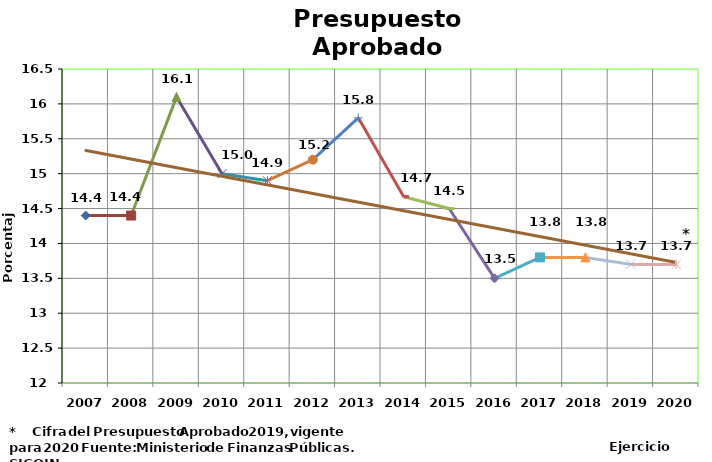
| Category | Series 0 |
|---|---|
| 2007 | 14.4 |
| 2008 | 14.4 |
| 2009 | 16.1 |
| 2010 | 15 |
| 2011 | 14.9 |
| 2012 | 15.2 |
| 2013 | 15.8 |
| 2014 | 14.67 |
| 2015 | 14.5 |
| 2016 | 13.5 |
| 2017 | 13.8 |
| 2018 | 13.8 |
| 2019 | 13.7 |
| 2020 | 13.7 |